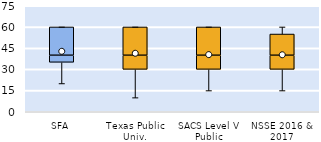
| Category | 25th | 50th | 75th |
|---|---|---|---|
| SFA | 35 | 5 | 20 |
| Texas Public Univ. | 30 | 10 | 20 |
| SACS Level V Public | 30 | 10 | 20 |
| NSSE 2016 & 2017 | 30 | 10 | 15 |